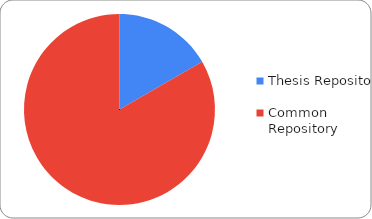
| Category | Series 0 |
|---|---|
| Thesis Repository | 4 |
| Common Repository | 20 |